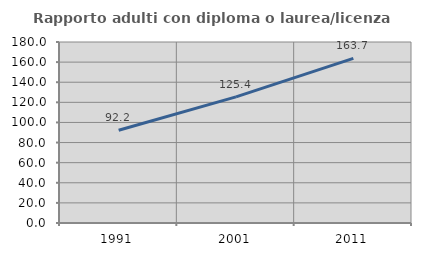
| Category | Rapporto adulti con diploma o laurea/licenza media  |
|---|---|
| 1991.0 | 92.248 |
| 2001.0 | 125.424 |
| 2011.0 | 163.731 |